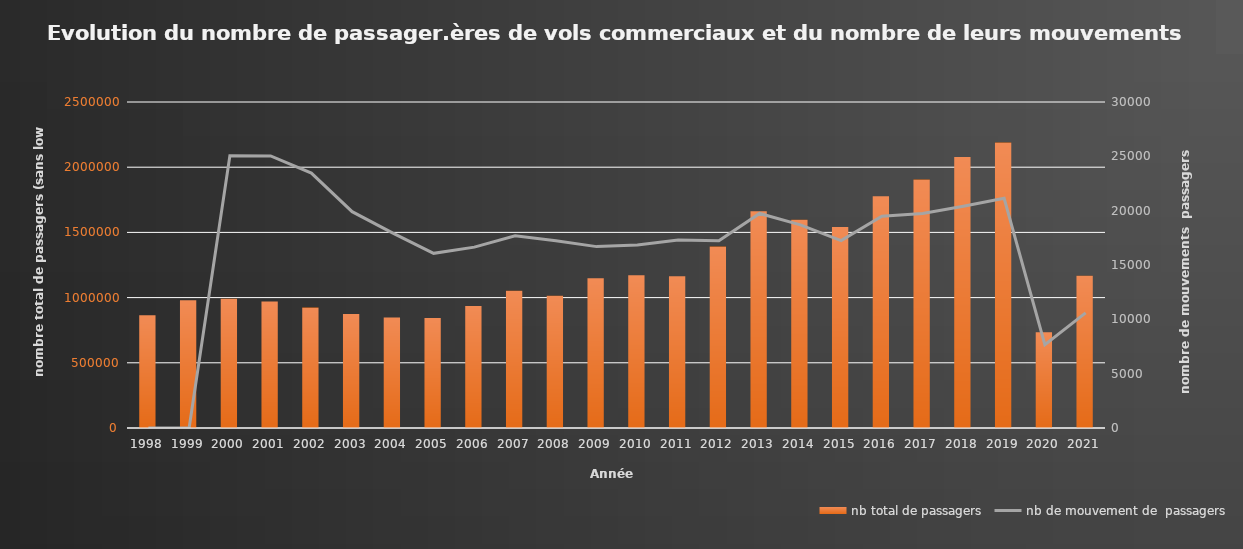
| Category | nb total de passagers |
|---|---|
| 1998.0 | 865193 |
| 1999.0 | 978908 |
| 2000.0 | 990598 |
| 2001.0 | 970391 |
| 2002.0 | 923148 |
| 2003.0 | 873600 |
| 2004.0 | 848037 |
| 2005.0 | 842650 |
| 2006.0 | 936032 |
| 2007.0 | 1051758 |
| 2008.0 | 1014704 |
| 2009.0 | 1147924 |
| 2010.0 | 1170693 |
| 2011.0 | 1164631 |
| 2012.0 | 1391637 |
| 2013.0 | 1661741 |
| 2014.0 | 1596700 |
| 2015.0 | 1541894 |
| 2016.0 | 1776715 |
| 2017.0 | 1905608 |
| 2018.0 | 2078549 |
| 2019.0 | 2189221 |
| 2020.0 | 734982 |
| 2021.0 | 1167042 |